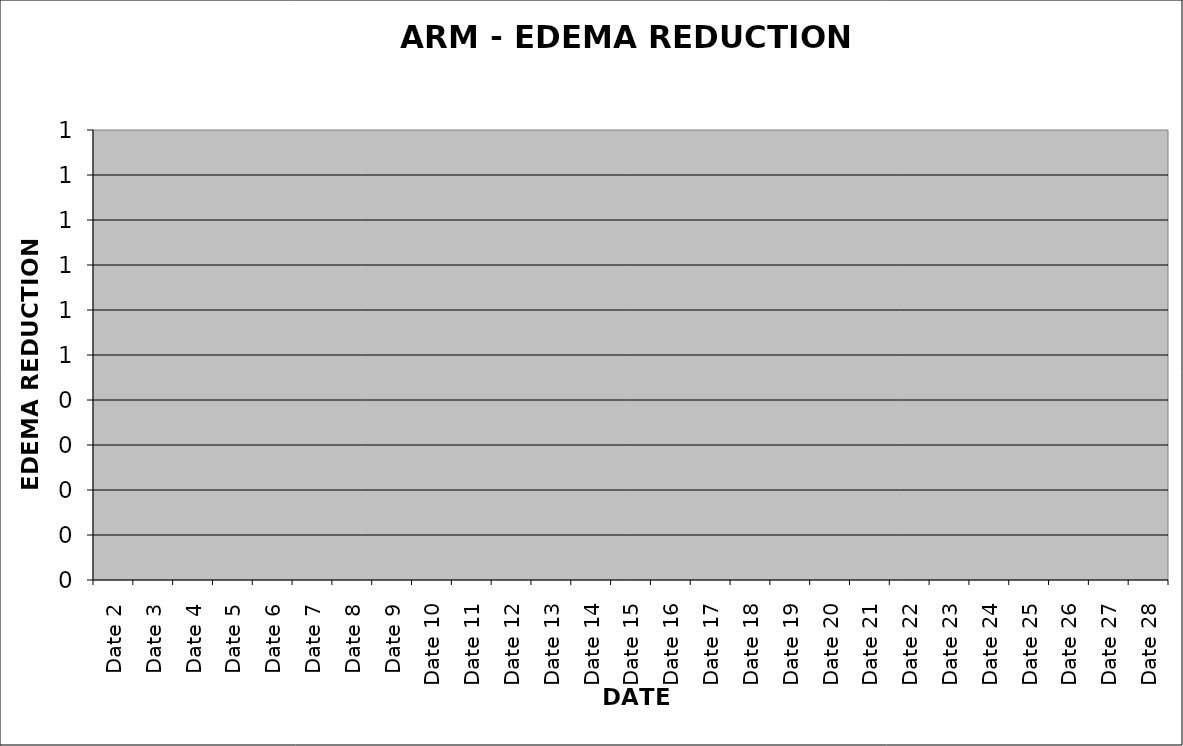
| Category | Series 0 |
|---|---|
| Date 2 | 0 |
| Date 3 | 0 |
| Date 4 | 0 |
| Date 5 | 0 |
| Date 6 | 0 |
| Date 7 | 0 |
| Date 8 | 0 |
| Date 9 | 0 |
| Date 10 | 0 |
| Date 11 | 0 |
| Date 12 | 0 |
| Date 13 | 0 |
| Date 14 | 0 |
| Date 15 | 0 |
| Date 16 | 0 |
| Date 17 | 0 |
| Date 18 | 0 |
| Date 19 | 0 |
| Date 20 | 0 |
| Date 21 | 0 |
| Date 22 | 0 |
| Date 23 | 0 |
| Date 24 | 0 |
| Date 25 | 0 |
| Date 26 | 0 |
| Date 27 | 0 |
| Date 28 | 0 |